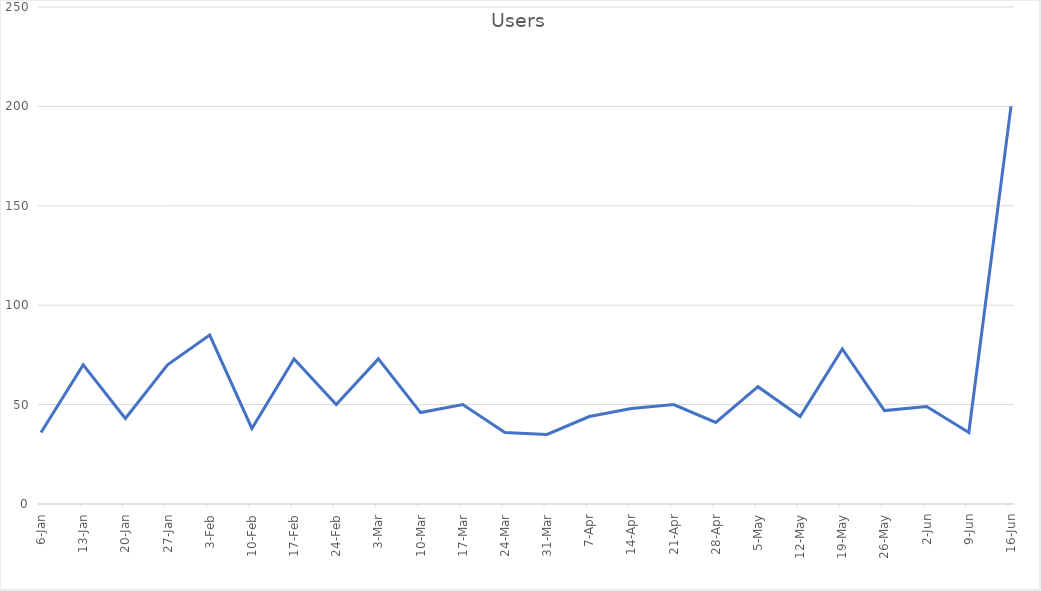
| Category | Users |
|---|---|
| 2021-06-16 | 200 |
| 2021-06-09 | 36 |
| 2021-06-02 | 49 |
| 2021-05-26 | 47 |
| 2021-05-19 | 78 |
| 2021-05-12 | 44 |
| 2021-05-05 | 59 |
| 2021-04-28 | 41 |
| 2021-04-21 | 50 |
| 2021-04-14 | 48 |
| 2021-04-07 | 44 |
| 2021-03-31 | 35 |
| 2021-03-24 | 36 |
| 2021-03-17 | 50 |
| 2021-03-10 | 46 |
| 2021-03-03 | 73 |
| 2021-02-24 | 50 |
| 2021-02-17 | 73 |
| 2021-02-10 | 38 |
| 2021-02-03 | 85 |
| 2021-01-27 | 70 |
| 2021-01-20 | 43 |
| 2021-01-13 | 70 |
| 2021-01-06 | 36 |